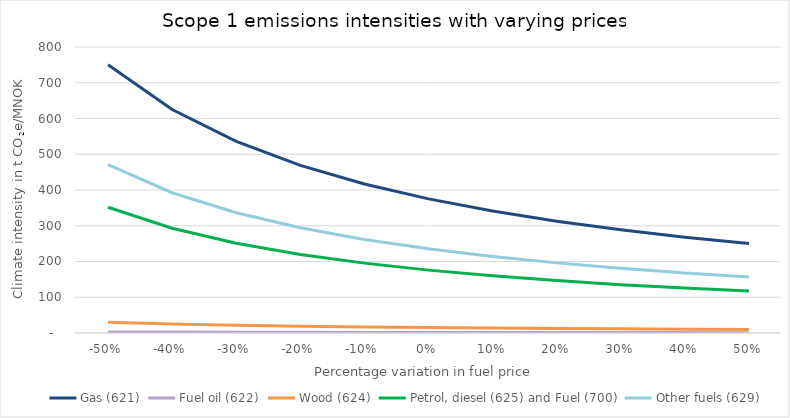
| Category | Gas (621) | Fuel oil (622) | Wood (624) | Petrol, diesel (625) and Fuel (700) | Other fuels (629) |
|---|---|---|---|---|---|
| -0.5 | 750.226 | 3.065 | 30.26 | 351.784 | 470.804 |
| -0.4 | 625.188 | 2.554 | 25.217 | 293.153 | 392.337 |
| -0.3 | 535.876 | 2.189 | 21.614 | 251.274 | 336.289 |
| -0.2 | 468.891 | 1.915 | 18.912 | 219.865 | 294.253 |
| -0.1 | 416.792 | 1.703 | 16.811 | 195.436 | 261.558 |
| 0.0 | 375.113 | 1.532 | 15.13 | 175.892 | 235.402 |
| 0.1 | 341.012 | 1.393 | 13.755 | 159.902 | 214.002 |
| 0.2 | 312.594 | 1.277 | 12.608 | 146.577 | 196.168 |
| 0.3 | 288.548 | 1.179 | 11.638 | 135.302 | 181.078 |
| 0.4 | 267.938 | 1.094 | 10.807 | 125.637 | 168.144 |
| 0.5 | 250.075 | 1.022 | 10.087 | 117.261 | 156.935 |